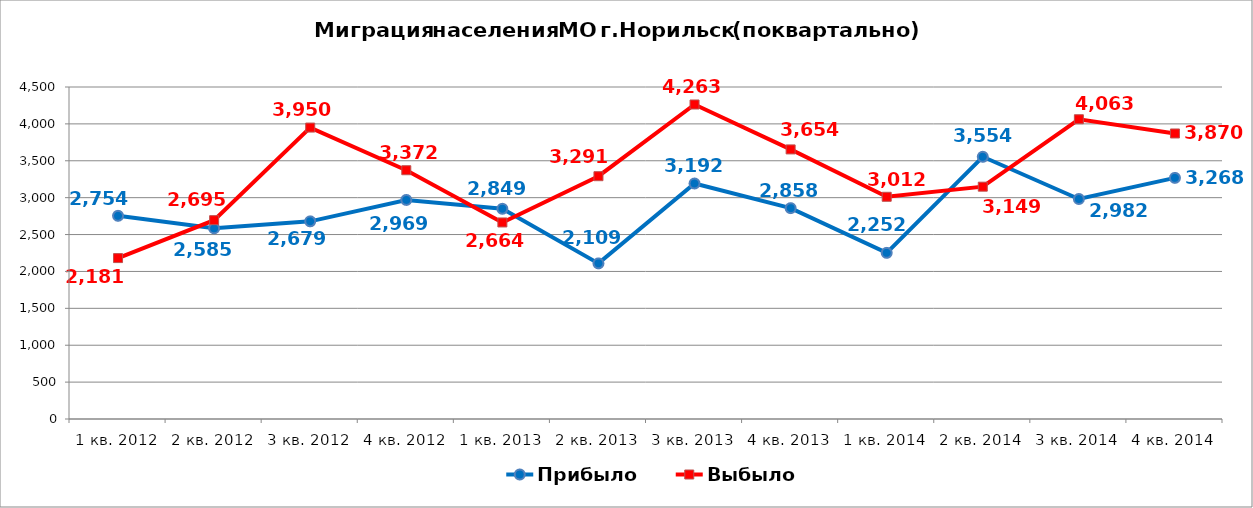
| Category | Прибыло | Выбыло |
|---|---|---|
| 1 кв. 2012 | 2754 | 2181 |
| 2 кв. 2012 | 2585 | 2695 |
| 3 кв. 2012 | 2679 | 3950 |
| 4 кв. 2012 | 2969 | 3372 |
| 1 кв. 2013 | 2849 | 2664 |
| 2 кв. 2013 | 2109 | 3291 |
| 3 кв. 2013 | 3192 | 4263 |
| 4 кв. 2013 | 2858 | 3654 |
| 1 кв. 2014 | 2252 | 3012 |
| 2 кв. 2014 | 3554 | 3149 |
| 3 кв. 2014 | 2982 | 4063 |
| 4 кв. 2014 | 3268 | 3870 |